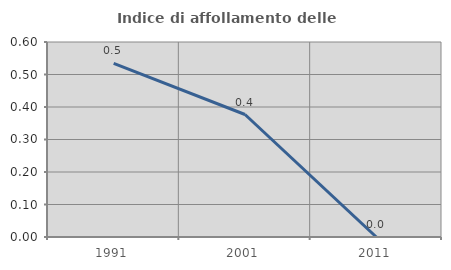
| Category | Indice di affollamento delle abitazioni  |
|---|---|
| 1991.0 | 0.534 |
| 2001.0 | 0.377 |
| 2011.0 | 0 |